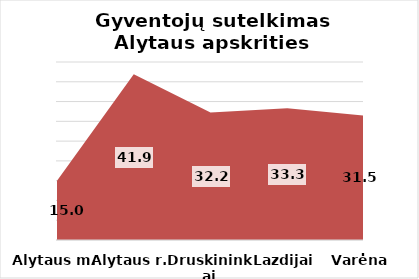
| Category | Series 0 |
|---|---|
| Alytaus m. | 15.01 |
| Alytaus r. | 41.89 |
| Druskininkai | 32.208 |
| Lazdijai | 33.32 |
| Varėna | 31.45 |